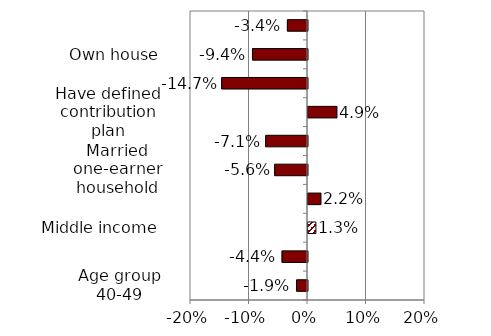
| Category | Series 0 |
|---|---|
| Age group 40-49 | -0.019 |
| Age group 50-59 | -0.044 |
| Middle income | 0.013 |
| High income | 0.022 |
| Married one-earner household | -0.056 |
| College degree | -0.071 |
| Have defined contribution plan | 0.049 |
| Have defined benefit plan | -0.147 |
| Own house | -0.094 |
| Risk averse | -0.034 |